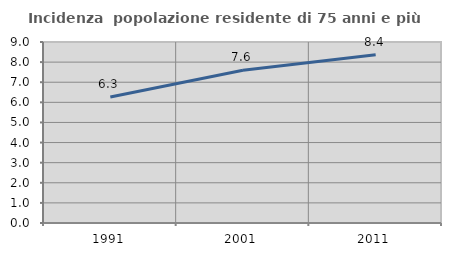
| Category | Incidenza  popolazione residente di 75 anni e più |
|---|---|
| 1991.0 | 6.263 |
| 2001.0 | 7.596 |
| 2011.0 | 8.366 |